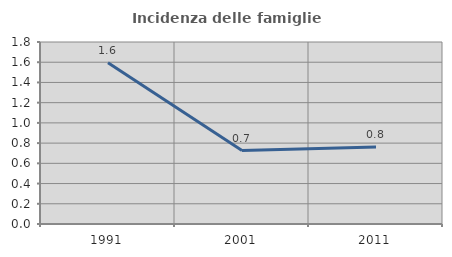
| Category | Incidenza delle famiglie numerose |
|---|---|
| 1991.0 | 1.596 |
| 2001.0 | 0.726 |
| 2011.0 | 0.761 |